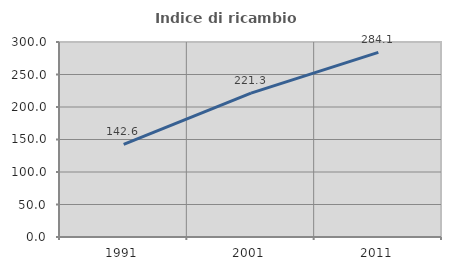
| Category | Indice di ricambio occupazionale  |
|---|---|
| 1991.0 | 142.636 |
| 2001.0 | 221.25 |
| 2011.0 | 284.058 |